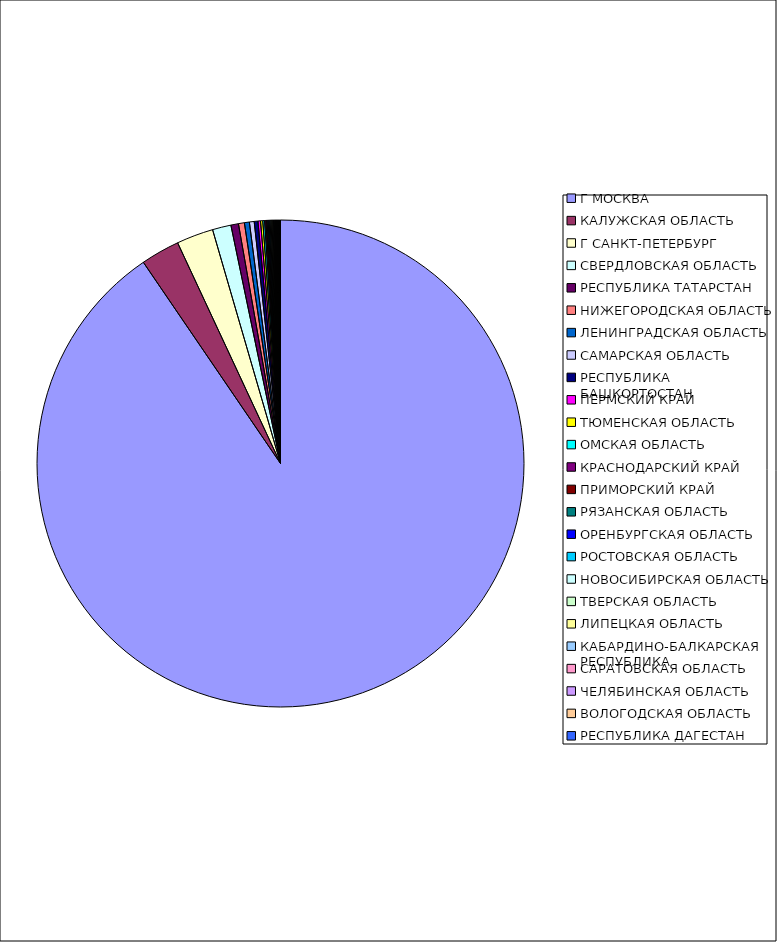
| Category | Оборот |
|---|---|
| Г МОСКВА | 0.904 |
| КАЛУЖСКАЯ ОБЛАСТЬ | 0.026 |
| Г САНКТ-ПЕТЕРБУРГ | 0.024 |
| СВЕРДЛОВСКАЯ ОБЛАСТЬ | 0.012 |
| РЕСПУБЛИКА ТАТАРСТАН | 0.005 |
| НИЖЕГОРОДСКАЯ ОБЛАСТЬ | 0.004 |
| ЛЕНИНГРАДСКАЯ ОБЛАСТЬ | 0.003 |
| САМАРСКАЯ ОБЛАСТЬ | 0.003 |
| РЕСПУБЛИКА БАШКОРТОСТАН | 0.002 |
| ПЕРМСКИЙ КРАЙ | 0.002 |
| ТЮМЕНСКАЯ ОБЛАСТЬ | 0.001 |
| ОМСКАЯ ОБЛАСТЬ | 0.001 |
| КРАСНОДАРСКИЙ КРАЙ | 0.001 |
| ПРИМОРСКИЙ КРАЙ | 0.001 |
| РЯЗАНСКАЯ ОБЛАСТЬ | 0.001 |
| ОРЕНБУРГСКАЯ ОБЛАСТЬ | 0.001 |
| РОСТОВСКАЯ ОБЛАСТЬ | 0.001 |
| НОВОСИБИРСКАЯ ОБЛАСТЬ | 0.001 |
| ТВЕРСКАЯ ОБЛАСТЬ | 0.001 |
| ЛИПЕЦКАЯ ОБЛАСТЬ | 0.001 |
| КАБАРДИНО-БАЛКАРСКАЯ РЕСПУБЛИКА | 0 |
| САРАТОВСКАЯ ОБЛАСТЬ | 0 |
| ЧЕЛЯБИНСКАЯ ОБЛАСТЬ | 0 |
| ВОЛОГОДСКАЯ ОБЛАСТЬ | 0 |
| РЕСПУБЛИКА ДАГЕСТАН | 0 |
| МОСКОВСКАЯ ОБЛАСТЬ | 0 |
| ИВАНОВСКАЯ ОБЛАСТЬ | 0 |
| БЕЛГОРОДСКАЯ ОБЛАСТЬ | 0 |
| ПСКОВСКАЯ ОБЛАСТЬ | 0 |
| УДМУРТСКАЯ РЕСПУБЛИКА | 0 |
| ЯРОСЛАВСКАЯ ОБЛАСТЬ | 0 |
| СМОЛЕНСКАЯ ОБЛАСТЬ | 0 |
| ИРКУТСКАЯ ОБЛАСТЬ | 0 |
| РЕСПУБЛИКА МОРДОВИЯ | 0 |
| СТАВРОПОЛЬСКИЙ КРАЙ | 0 |
| КРАСНОЯРСКИЙ КРАЙ | 0 |
| КИРОВСКАЯ ОБЛАСТЬ | 0 |
| РЕСПУБЛИКА СЕВЕРНАЯ ОСЕТИЯ-АЛАНИЯ | 0 |
| РЕСПУБЛИКА ХАКАСИЯ | 0 |
| КАРАЧАЕВО-ЧЕРКЕССКАЯ РЕСПУБЛИКА | 0 |
| АЛТАЙСКИЙ КРАЙ | 0 |
| МУРМАНСКАЯ ОБЛАСТЬ | 0 |
| ВОРОНЕЖСКАЯ ОБЛАСТЬ | 0 |
| САХАЛИНСКАЯ ОБЛАСТЬ | 0 |
| КУРГАНСКАЯ ОБЛАСТЬ | 0 |
| КУРСКАЯ ОБЛАСТЬ | 0 |